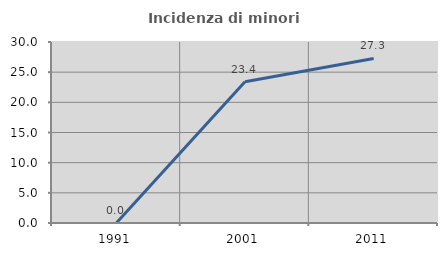
| Category | Incidenza di minori stranieri |
|---|---|
| 1991.0 | 0 |
| 2001.0 | 23.404 |
| 2011.0 | 27.273 |